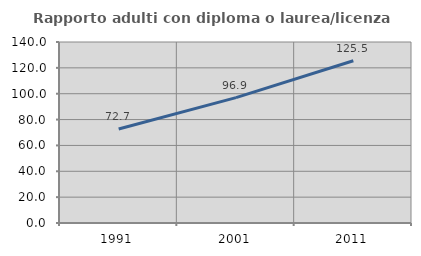
| Category | Rapporto adulti con diploma o laurea/licenza media  |
|---|---|
| 1991.0 | 72.727 |
| 2001.0 | 96.948 |
| 2011.0 | 125.497 |